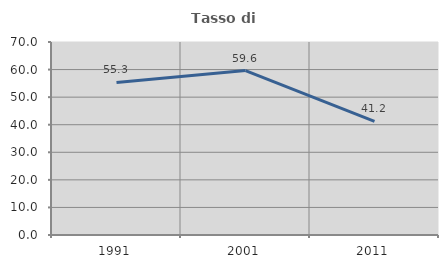
| Category | Tasso di occupazione   |
|---|---|
| 1991.0 | 55.346 |
| 2001.0 | 59.649 |
| 2011.0 | 41.176 |